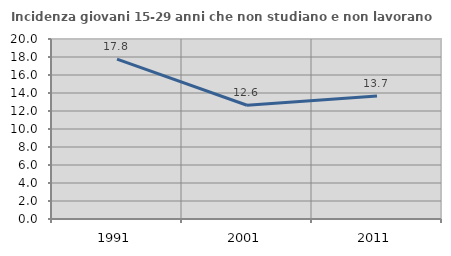
| Category | Incidenza giovani 15-29 anni che non studiano e non lavorano  |
|---|---|
| 1991.0 | 17.77 |
| 2001.0 | 12.64 |
| 2011.0 | 13.674 |